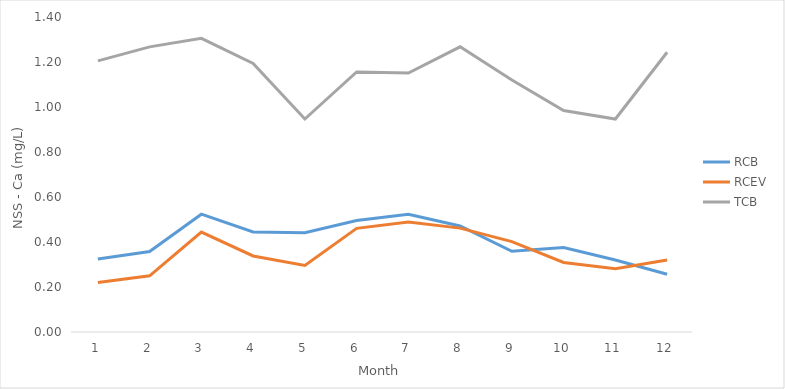
| Category | RCB | RCEV | TCB |
|---|---|---|---|
| 0 | 0.325 | 0.22 | 1.205 |
| 1 | 0.358 | 0.25 | 1.267 |
| 2 | 0.524 | 0.444 | 1.305 |
| 3 | 0.445 | 0.338 | 1.193 |
| 4 | 0.441 | 0.296 | 0.947 |
| 5 | 0.496 | 0.461 | 1.156 |
| 6 | 0.523 | 0.489 | 1.151 |
| 7 | 0.471 | 0.462 | 1.268 |
| 8 | 0.359 | 0.402 | 1.12 |
| 9 | 0.375 | 0.309 | 0.984 |
| 10 | 0.32 | 0.282 | 0.947 |
| 11 | 0.256 | 0.32 | 1.243 |